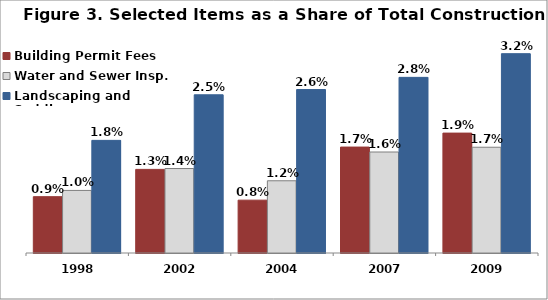
| Category | Building Permit Fees | Water and Sewer Insp. | Landscaping and Sodding |
|---|---|---|---|
| 1998.0 | 0.009 | 0.01 | 0.018 |
| 2002.0 | 0.013 | 0.014 | 0.025 |
| 2004.0 | 0.008 | 0.012 | 0.026 |
| 2007.0 | 0.017 | 0.016 | 0.028 |
| 2009.0 | 0.019 | 0.017 | 0.032 |